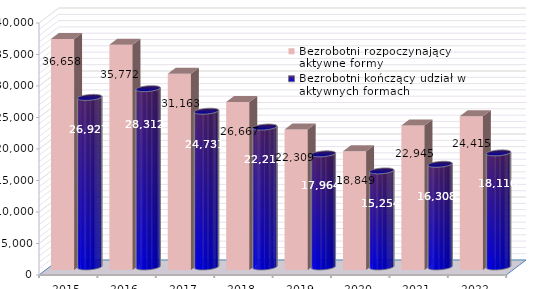
| Category | Bezrobotni rozpoczynający aktywne formy | Bezrobotni kończący udział w aktywnych formach |
|---|---|---|
| 2015.0 | 36658 | 26927 |
| 2016.0 | 35772 | 28312 |
| 2017.0 | 31163 | 24731 |
| 2018.0 | 26667 | 22212 |
| 2019.0 | 22309 | 17964 |
| 2020.0 | 18849 | 15254 |
| 2021.0 | 22945 | 16308 |
| 2022.0 | 24415 | 18116 |